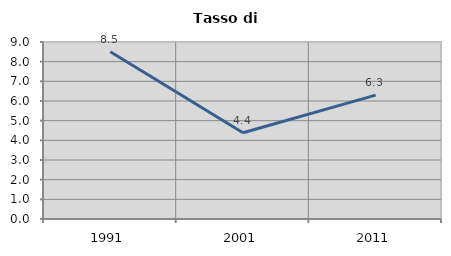
| Category | Tasso di disoccupazione   |
|---|---|
| 1991.0 | 8.5 |
| 2001.0 | 4.385 |
| 2011.0 | 6.3 |